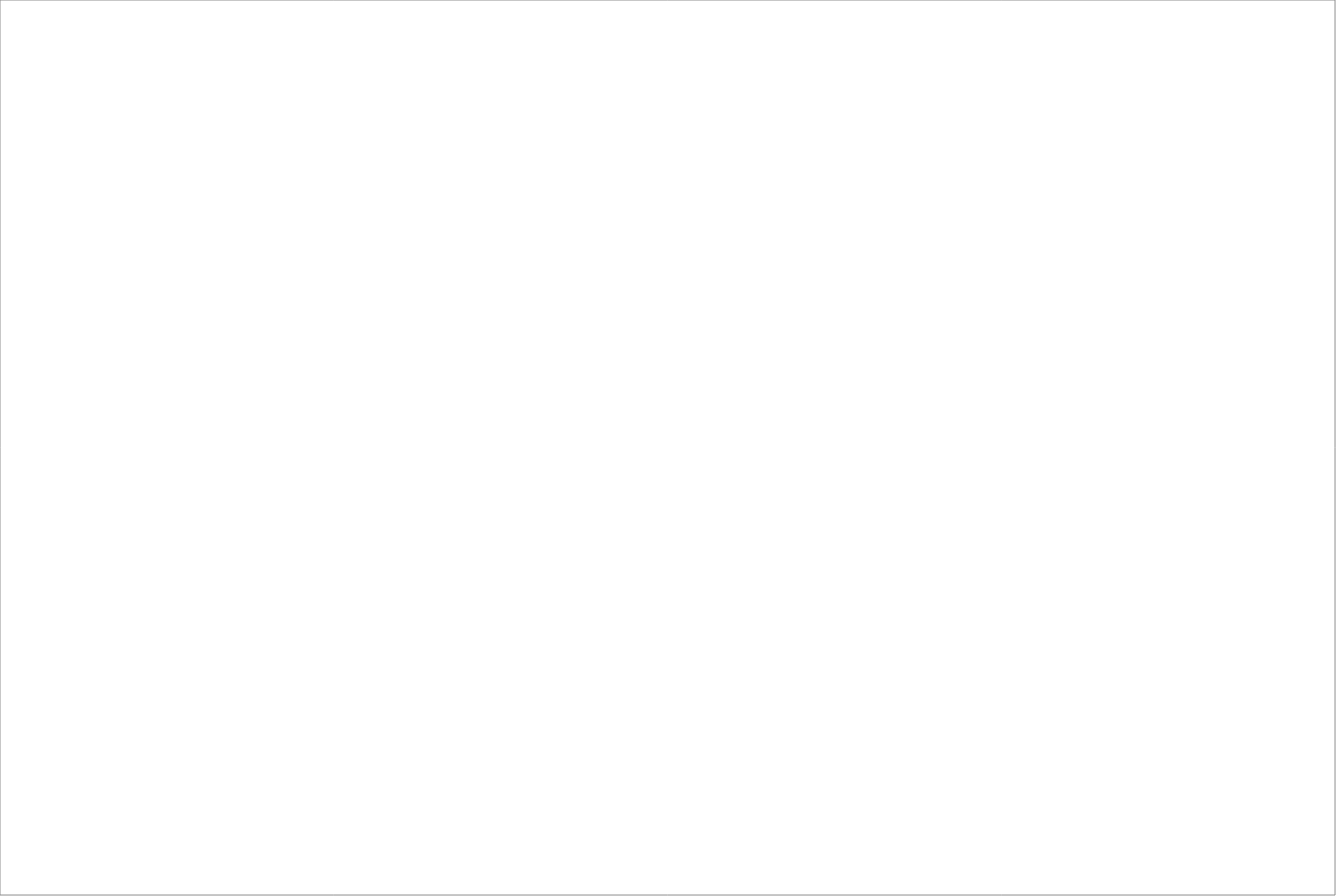
| Category | Total |
|---|---|
| Randstad AB | 77.5 |
| Poolia Sverige Aktiebolag | 65 |
| StudentConsulting Sweden AB | 65 |
| Experis AB | 62.5 |
| Academic Work Sweden AB | 62.5 |